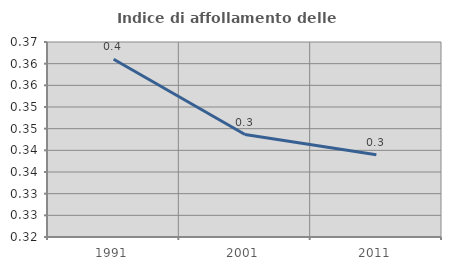
| Category | Indice di affollamento delle abitazioni  |
|---|---|
| 1991.0 | 0.361 |
| 2001.0 | 0.344 |
| 2011.0 | 0.339 |